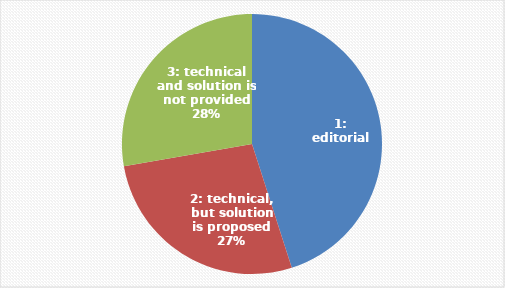
| Category | Series 0 |
|---|---|
| 1: editorial | 91 |
| 2: technical, but solution is proposed | 55 |
| 3: technical and solution is not provided | 56 |